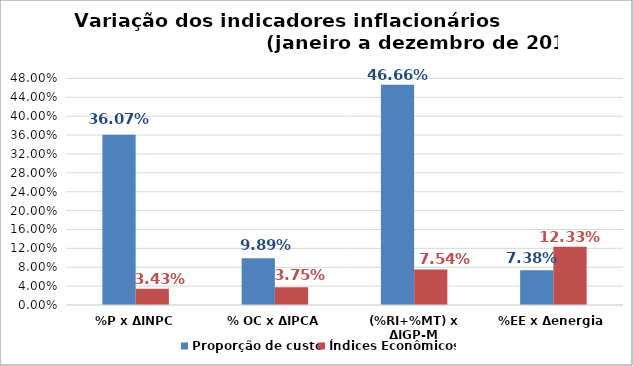
| Category | Proporção de custo | Índices Econômicos |
|---|---|---|
| %P x ΔINPC | 0.361 | 0.034 |
| % OC x ΔIPCA | 0.099 | 0.037 |
| (%RI+%MT) x ΔIGP-M | 0.467 | 0.075 |
| %EE x Δenergia | 0.074 | 0.123 |